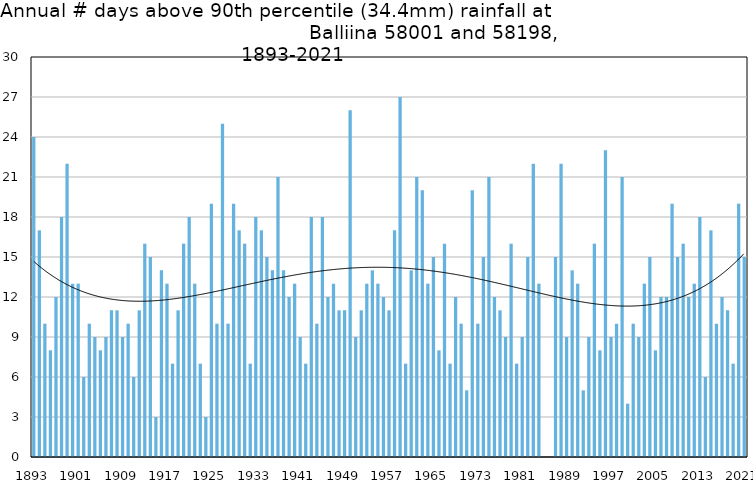
| Category | Annual # days above 90th percentile |
|---|---|
| 1893 | 24 |
| 1894 | 17 |
| 1895 | 10 |
| 1896 | 8 |
| 1897 | 12 |
| 1898 | 18 |
| 1899 | 22 |
| 1900 | 13 |
| 1901 | 13 |
| 1902 | 6 |
| 1903 | 10 |
| 1904 | 9 |
| 1905 | 8 |
| 1906 | 9 |
| 1907 | 11 |
| 1908 | 11 |
| 1909 | 9 |
| 1910 | 10 |
| 1911 | 6 |
| 1912 | 11 |
| 1913 | 16 |
| 1914 | 15 |
| 1915 | 3 |
| 1916 | 14 |
| 1917 | 13 |
| 1918 | 7 |
| 1919 | 11 |
| 1920 | 16 |
| 1921 | 18 |
| 1922 | 13 |
| 1923 | 7 |
| 1924 | 3 |
| 1925 | 19 |
| 1926 | 10 |
| 1927 | 25 |
| 1928 | 10 |
| 1929 | 19 |
| 1930 | 17 |
| 1931 | 16 |
| 1932 | 7 |
| 1933 | 18 |
| 1934 | 17 |
| 1935 | 15 |
| 1936 | 14 |
| 1937 | 21 |
| 1938 | 14 |
| 1939 | 12 |
| 1940 | 13 |
| 1941 | 9 |
| 1942 | 7 |
| 1943 | 18 |
| 1944 | 10 |
| 1945 | 18 |
| 1946 | 12 |
| 1947 | 13 |
| 1948 | 11 |
| 1949 | 11 |
| 1950 | 26 |
| 1951 | 9 |
| 1952 | 11 |
| 1953 | 13 |
| 1954 | 14 |
| 1955 | 13 |
| 1956 | 12 |
| 1957 | 11 |
| 1958 | 17 |
| 1959 | 27 |
| 1960 | 7 |
| 1961 | 14 |
| 1962 | 21 |
| 1963 | 20 |
| 1964 | 13 |
| 1965 | 15 |
| 1966 | 8 |
| 1967 | 16 |
| 1968 | 7 |
| 1969 | 12 |
| 1970 | 10 |
| 1971 | 5 |
| 1972 | 20 |
| 1973 | 10 |
| 1974 | 15 |
| 1975 | 21 |
| 1976 | 12 |
| 1977 | 11 |
| 1978 | 9 |
| 1979 | 16 |
| 1980 | 7 |
| 1981 | 9 |
| 1982 | 15 |
| 1983 | 22 |
| 1984 | 13 |
| 1985 | 0 |
| 1986 | 0 |
| 1987 | 15 |
| 1988 | 22 |
| 1989 | 9 |
| 1990 | 14 |
| 1991 | 13 |
| 1992 | 5 |
| 1993 | 9 |
| 1994 | 16 |
| 1995 | 8 |
| 1996 | 23 |
| 1997 | 9 |
| 1998 | 10 |
| 1999 | 21 |
| 2000 | 4 |
| 2001 | 10 |
| 2002 | 9 |
| 2003 | 13 |
| 2004 | 15 |
| 2005 | 8 |
| 2006 | 12 |
| 2007 | 12 |
| 2008 | 19 |
| 2009 | 15 |
| 2010 | 16 |
| 2011 | 12 |
| 2012 | 13 |
| 2013 | 18 |
| 2014 | 6 |
| 2015 | 17 |
| 2016 | 10 |
| 2017 | 12 |
| 2018 | 11 |
| 2019 | 7 |
| 2020 | 19 |
| 2021 | 15 |